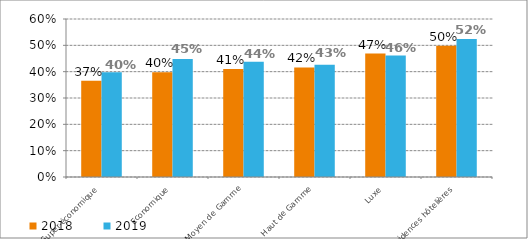
| Category | 2018 | 2019 |
|---|---|---|
| Super-économique | 0.365 | 0.397 |
| Economique | 0.398 | 0.448 |
| Moyen de Gamme | 0.41 | 0.438 |
| Haut de Gamme | 0.416 | 0.427 |
| Luxe | 0.469 | 0.461 |
| Résidences hôtelières | 0.498 | 0.524 |